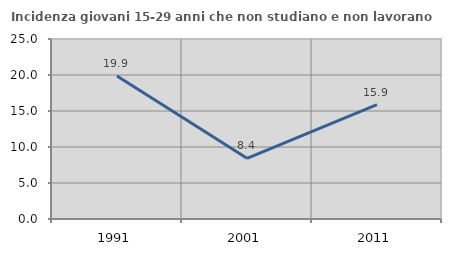
| Category | Incidenza giovani 15-29 anni che non studiano e non lavorano  |
|---|---|
| 1991.0 | 19.867 |
| 2001.0 | 8.426 |
| 2011.0 | 15.877 |